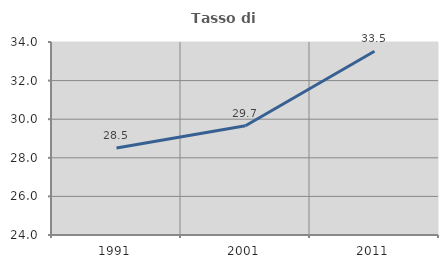
| Category | Tasso di occupazione   |
|---|---|
| 1991.0 | 28.504 |
| 2001.0 | 29.663 |
| 2011.0 | 33.52 |